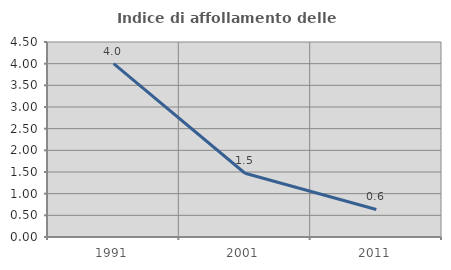
| Category | Indice di affollamento delle abitazioni  |
|---|---|
| 1991.0 | 4 |
| 2001.0 | 1.471 |
| 2011.0 | 0.636 |